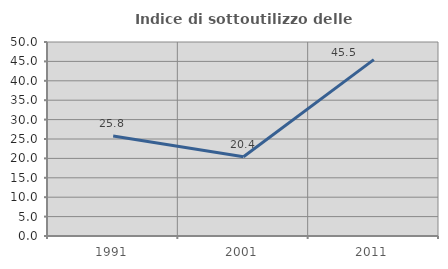
| Category | Indice di sottoutilizzo delle abitazioni  |
|---|---|
| 1991.0 | 25.773 |
| 2001.0 | 20.43 |
| 2011.0 | 45.455 |